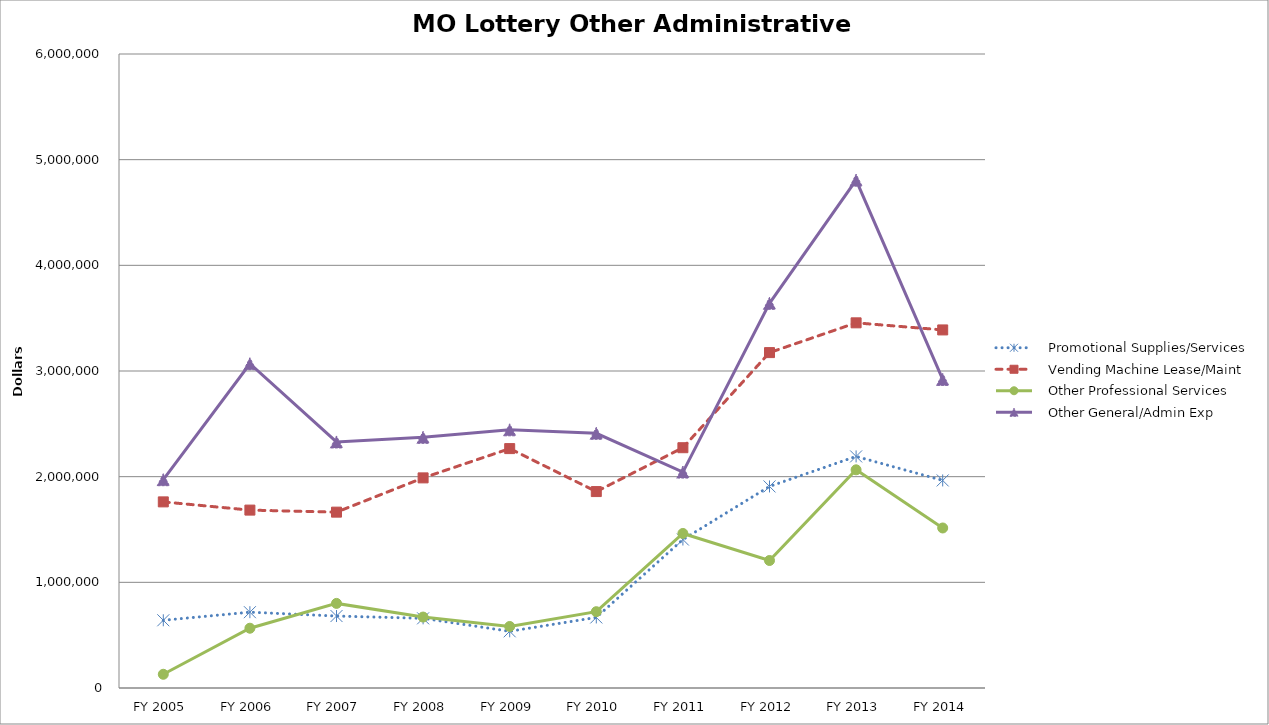
| Category |    Promotional Supplies/Services |    Vending Machine Lease/Maint |    Other Professional Services |    Other General/Admin Exp |
|---|---|---|---|---|
| FY 2005 | 640999 | 1761366 | 129859 | 1971354 |
| FY 2006 | 717522 | 1683571 | 565754 | 3068818 |
| FY 2007 | 680956 | 1664268 | 800662 | 2328651 |
| FY 2008 | 659255 | 1988454 | 671335 | 2372251 |
| FY 2009 | 536564 | 2265536 | 582172 | 2443677 |
| FY 2010 | 667642 | 1858902 | 722098 | 2410442 |
| FY 2011 | 1405165 | 2274069 | 1462536 | 2043494 |
| FY 2012 | 1907492 | 3174186 | 1206643 | 3640620 |
| FY 2013 | 2191620 | 3455773 | 2064777 | 4806335 |
| FY 2014 | 1964417 | 3388730 | 1514430 | 2920678 |